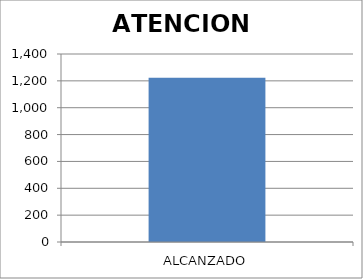
| Category | ATENCION BRINDADA |
|---|---|
| ALCANZADO | 1223 |